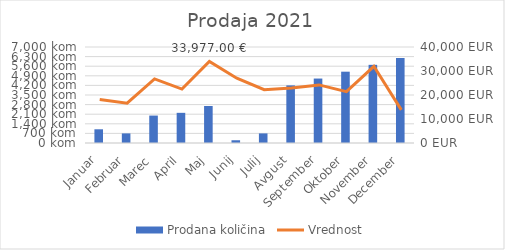
| Category | Prodana količina |
|---|---|
| Januar | 1000 |
| Februar | 700 |
| Marec | 2000 |
| April | 2200 |
| Maj | 2700 |
| Junij | 200 |
| Julij | 700 |
| Avgust | 4200 |
| September | 4700 |
| Oktober | 5200 |
| November | 5700 |
| December | 6200 |